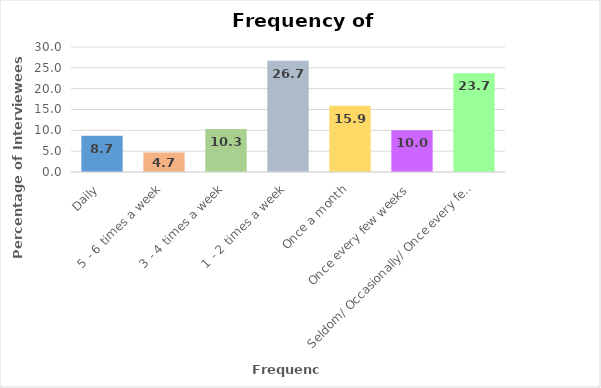
| Category | Series 0 |
|---|---|
| Daily | 8.7 |
| 5 - 6 times a week | 4.7 |
| 3 - 4 times a week | 10.3 |
| 1 - 2 times a week | 26.7 |
| Once a month | 15.9 |
| Once every few weeks | 10 |
| Seldom/ Occasionally/ Once every few mths | 23.7 |